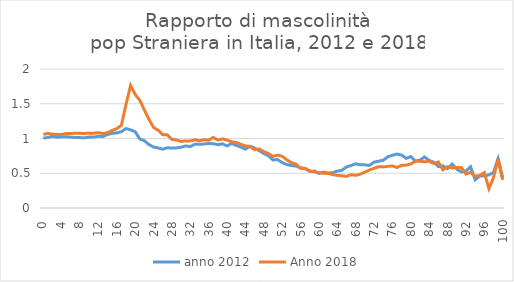
| Category | anno 2012 | Anno 2018 |
|---|---|---|
| 0.0 | 1.006 | 1.059 |
| 1.0 | 1.014 | 1.073 |
| 2.0 | 1.032 | 1.062 |
| 3.0 | 1.018 | 1.057 |
| 4.0 | 1.025 | 1.058 |
| 5.0 | 1.026 | 1.073 |
| 6.0 | 1.02 | 1.073 |
| 7.0 | 1.013 | 1.075 |
| 8.0 | 1.013 | 1.074 |
| 9.0 | 1.01 | 1.073 |
| 10.0 | 1.021 | 1.077 |
| 11.0 | 1.021 | 1.077 |
| 12.0 | 1.032 | 1.083 |
| 13.0 | 1.029 | 1.071 |
| 14.0 | 1.058 | 1.084 |
| 15.0 | 1.075 | 1.116 |
| 16.0 | 1.08 | 1.142 |
| 17.0 | 1.098 | 1.191 |
| 18.0 | 1.143 | 1.489 |
| 19.0 | 1.124 | 1.763 |
| 20.0 | 1.098 | 1.634 |
| 21.0 | 0.994 | 1.55 |
| 22.0 | 0.968 | 1.41 |
| 23.0 | 0.913 | 1.277 |
| 24.0 | 0.877 | 1.159 |
| 25.0 | 0.863 | 1.119 |
| 26.0 | 0.846 | 1.055 |
| 27.0 | 0.868 | 1.053 |
| 28.0 | 0.861 | 0.986 |
| 29.0 | 0.865 | 0.978 |
| 30.0 | 0.875 | 0.957 |
| 31.0 | 0.893 | 0.966 |
| 32.0 | 0.885 | 0.965 |
| 33.0 | 0.919 | 0.982 |
| 34.0 | 0.918 | 0.968 |
| 35.0 | 0.92 | 0.982 |
| 36.0 | 0.928 | 0.976 |
| 37.0 | 0.925 | 1.015 |
| 38.0 | 0.911 | 0.977 |
| 39.0 | 0.923 | 0.994 |
| 40.0 | 0.893 | 0.977 |
| 41.0 | 0.929 | 0.953 |
| 42.0 | 0.9 | 0.945 |
| 43.0 | 0.876 | 0.916 |
| 44.0 | 0.846 | 0.893 |
| 45.0 | 0.89 | 0.885 |
| 46.0 | 0.863 | 0.837 |
| 47.0 | 0.825 | 0.85 |
| 48.0 | 0.783 | 0.812 |
| 49.0 | 0.752 | 0.785 |
| 50.0 | 0.69 | 0.742 |
| 51.0 | 0.698 | 0.761 |
| 52.0 | 0.652 | 0.744 |
| 53.0 | 0.626 | 0.693 |
| 54.0 | 0.611 | 0.652 |
| 55.0 | 0.603 | 0.631 |
| 56.0 | 0.579 | 0.57 |
| 57.0 | 0.565 | 0.571 |
| 58.0 | 0.527 | 0.533 |
| 59.0 | 0.531 | 0.521 |
| 60.0 | 0.497 | 0.507 |
| 61.0 | 0.517 | 0.5 |
| 62.0 | 0.504 | 0.497 |
| 63.0 | 0.508 | 0.481 |
| 64.0 | 0.531 | 0.469 |
| 65.0 | 0.543 | 0.464 |
| 66.0 | 0.59 | 0.455 |
| 67.0 | 0.612 | 0.481 |
| 68.0 | 0.635 | 0.47 |
| 69.0 | 0.621 | 0.487 |
| 70.0 | 0.621 | 0.516 |
| 71.0 | 0.612 | 0.547 |
| 72.0 | 0.66 | 0.571 |
| 73.0 | 0.674 | 0.594 |
| 74.0 | 0.687 | 0.592 |
| 75.0 | 0.737 | 0.599 |
| 76.0 | 0.759 | 0.606 |
| 77.0 | 0.776 | 0.582 |
| 78.0 | 0.761 | 0.613 |
| 79.0 | 0.714 | 0.617 |
| 80.0 | 0.74 | 0.635 |
| 81.0 | 0.676 | 0.672 |
| 82.0 | 0.69 | 0.672 |
| 83.0 | 0.734 | 0.665 |
| 84.0 | 0.684 | 0.673 |
| 85.0 | 0.659 | 0.639 |
| 86.0 | 0.594 | 0.662 |
| 87.0 | 0.607 | 0.55 |
| 88.0 | 0.565 | 0.594 |
| 89.0 | 0.633 | 0.576 |
| 90.0 | 0.559 | 0.584 |
| 91.0 | 0.519 | 0.584 |
| 92.0 | 0.533 | 0.488 |
| 93.0 | 0.593 | 0.513 |
| 94.0 | 0.406 | 0.456 |
| 95.0 | 0.459 | 0.468 |
| 96.0 | 0.463 | 0.509 |
| 97.0 | 0.476 | 0.279 |
| 98.0 | 0.512 | 0.439 |
| 99.0 | 0.71 | 0.704 |
| 100.0 | 0.429 | 0.408 |